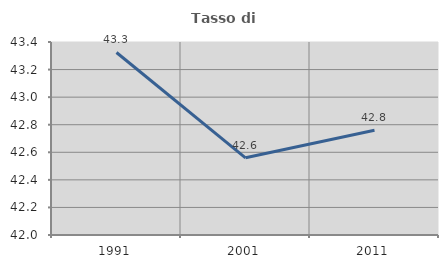
| Category | Tasso di occupazione   |
|---|---|
| 1991.0 | 43.324 |
| 2001.0 | 42.56 |
| 2011.0 | 42.76 |